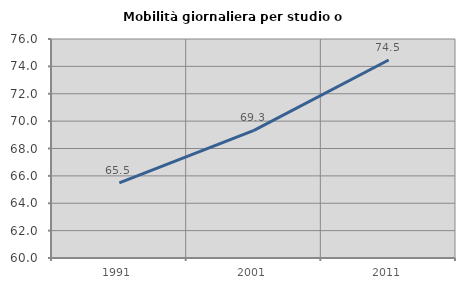
| Category | Mobilità giornaliera per studio o lavoro |
|---|---|
| 1991.0 | 65.495 |
| 2001.0 | 69.329 |
| 2011.0 | 74.463 |